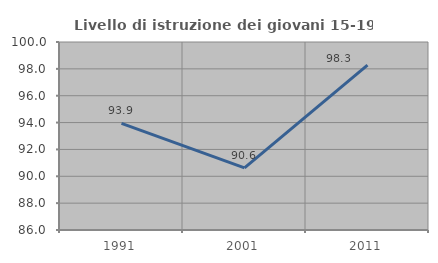
| Category | Livello di istruzione dei giovani 15-19 anni |
|---|---|
| 1991.0 | 93.939 |
| 2001.0 | 90.625 |
| 2011.0 | 98.276 |